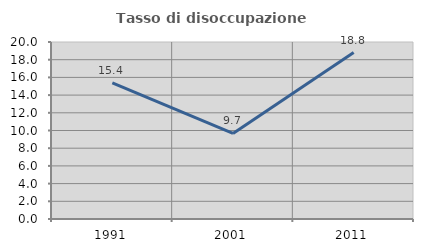
| Category | Tasso di disoccupazione giovanile  |
|---|---|
| 1991.0 | 15.395 |
| 2001.0 | 9.671 |
| 2011.0 | 18.812 |